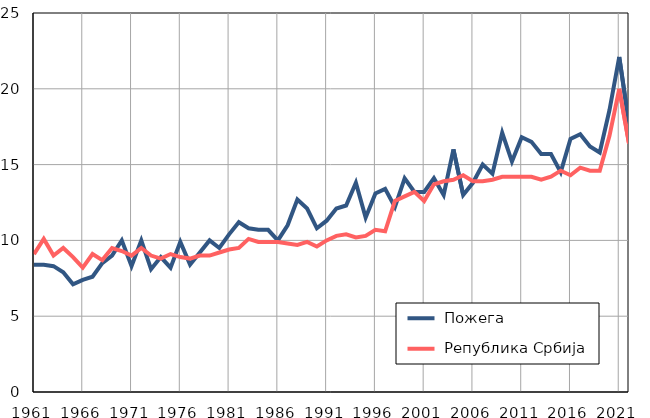
| Category |  Пожега |  Република Србија |
|---|---|---|
| 1961.0 | 8.4 | 9.1 |
| 1962.0 | 8.4 | 10.1 |
| 1963.0 | 8.3 | 9 |
| 1964.0 | 7.9 | 9.5 |
| 1965.0 | 7.1 | 8.9 |
| 1966.0 | 7.4 | 8.2 |
| 1967.0 | 7.6 | 9.1 |
| 1968.0 | 8.5 | 8.7 |
| 1969.0 | 9 | 9.5 |
| 1970.0 | 10 | 9.3 |
| 1971.0 | 8.3 | 9 |
| 1972.0 | 10 | 9.5 |
| 1973.0 | 8.1 | 9 |
| 1974.0 | 8.9 | 8.8 |
| 1975.0 | 8.2 | 9.1 |
| 1976.0 | 9.9 | 8.9 |
| 1977.0 | 8.4 | 8.8 |
| 1978.0 | 9.2 | 9 |
| 1979.0 | 10 | 9 |
| 1980.0 | 9.5 | 9.2 |
| 1981.0 | 10.4 | 9.4 |
| 1982.0 | 11.2 | 9.5 |
| 1983.0 | 10.8 | 10.1 |
| 1984.0 | 10.7 | 9.9 |
| 1985.0 | 10.7 | 9.9 |
| 1986.0 | 10 | 9.9 |
| 1987.0 | 11 | 9.8 |
| 1988.0 | 12.7 | 9.7 |
| 1989.0 | 12.1 | 9.9 |
| 1990.0 | 10.8 | 9.6 |
| 1991.0 | 11.3 | 10 |
| 1992.0 | 12.1 | 10.3 |
| 1993.0 | 12.3 | 10.4 |
| 1994.0 | 13.8 | 10.2 |
| 1995.0 | 11.5 | 10.3 |
| 1996.0 | 13.1 | 10.7 |
| 1997.0 | 13.4 | 10.6 |
| 1998.0 | 12.2 | 12.6 |
| 1999.0 | 14.1 | 12.9 |
| 2000.0 | 13.2 | 13.2 |
| 2001.0 | 13.2 | 12.6 |
| 2002.0 | 14.1 | 13.7 |
| 2003.0 | 13 | 13.9 |
| 2004.0 | 16 | 14 |
| 2005.0 | 13 | 14.3 |
| 2006.0 | 13.8 | 13.9 |
| 2007.0 | 15 | 13.9 |
| 2008.0 | 14.4 | 14 |
| 2009.0 | 17.1 | 14.2 |
| 2010.0 | 15.2 | 14.2 |
| 2011.0 | 16.8 | 14.2 |
| 2012.0 | 16.5 | 14.2 |
| 2013.0 | 15.7 | 14 |
| 2014.0 | 15.7 | 14.2 |
| 2015.0 | 14.5 | 14.6 |
| 2016.0 | 16.7 | 14.3 |
| 2017.0 | 17 | 14.8 |
| 2018.0 | 16.2 | 14.6 |
| 2019.0 | 15.8 | 14.6 |
| 2020.0 | 18.6 | 16.9 |
| 2021.0 | 22.1 | 20 |
| 2022.0 | 17.7 | 16.4 |